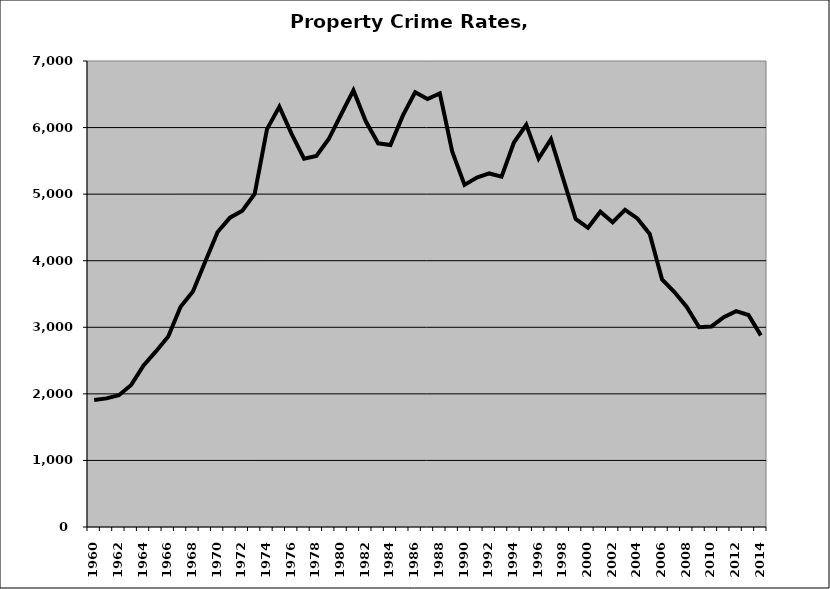
| Category | Property |
|---|---|
| 1960.0 | 1907.517 |
| 1961.0 | 1932.073 |
| 1962.0 | 1979.775 |
| 1963.0 | 2134.118 |
| 1964.0 | 2428.06 |
| 1965.0 | 2637.493 |
| 1966.0 | 2860.87 |
| 1967.0 | 3307.704 |
| 1968.0 | 3537.002 |
| 1969.0 | 3987.008 |
| 1970.0 | 4431.274 |
| 1971.0 | 4646.247 |
| 1972.0 | 4750.779 |
| 1973.0 | 5004.404 |
| 1974.0 | 5977.317 |
| 1975.0 | 6313.68 |
| 1976.0 | 5901.374 |
| 1977.0 | 5531.397 |
| 1978.0 | 5573.036 |
| 1979.0 | 5827.622 |
| 1980.0 | 6196.53 |
| 1981.0 | 6558.217 |
| 1982.0 | 6094.526 |
| 1983.0 | 5763.035 |
| 1984.0 | 5737.584 |
| 1985.0 | 6178.75 |
| 1986.0 | 6531.023 |
| 1987.0 | 6429.442 |
| 1988.0 | 6512.951 |
| 1989.0 | 5642.518 |
| 1990.0 | 5139.215 |
| 1991.0 | 5248.802 |
| 1992.0 | 5310.715 |
| 1993.0 | 5262.467 |
| 1994.0 | 5775.762 |
| 1995.0 | 6041.547 |
| 1996.0 | 5533.552 |
| 1997.0 | 5825.347 |
| 1998.0 | 5226.843 |
| 1999.0 | 4626.866 |
| 2000.0 | 4494.653 |
| 2001.0 | 4736.629 |
| 2002.0 | 4577.521 |
| 2003.0 | 4765.636 |
| 2004.0 | 4635.427 |
| 2005.0 | 4402.437 |
| 2006.0 | 3719.13 |
| 2007.0 | 3530.129 |
| 2008.0 | 3305.374 |
| 2009.0 | 3000.269 |
| 2010.0 | 3012.941 |
| 2011.0 | 3150.512 |
| 2012.0 | 3241.627 |
| 2013.0 | 3184.339 |
| 2014.0 | 2879.046 |